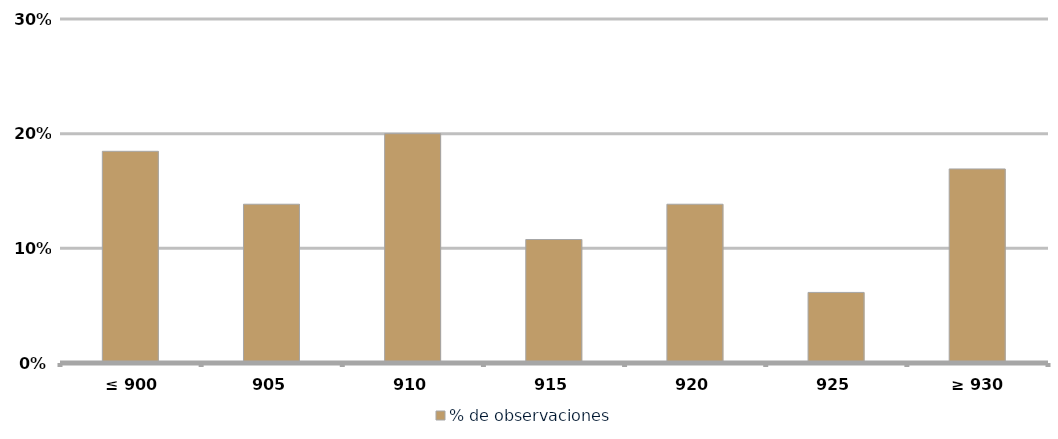
| Category | % de observaciones  |
|---|---|
|  ≤ 900  | 0.185 |
|  905  | 0.138 |
|  910  | 0.2 |
|  915  | 0.108 |
|  920  | 0.138 |
| 925,00 | 0.062 |
|  ≥ 930  | 0.169 |